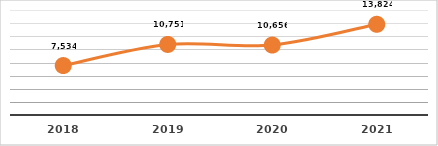
| Category | CERTIFICACIÓN DE COMPETENCIAS (%)
PRIMER TRIMESTRE, EJERCICIO 2021 |
|---|---|
| 2018.0 | 7534 |
| 2019.0 | 10751 |
| 2020.0 | 10656 |
| 2021.0 | 13824 |